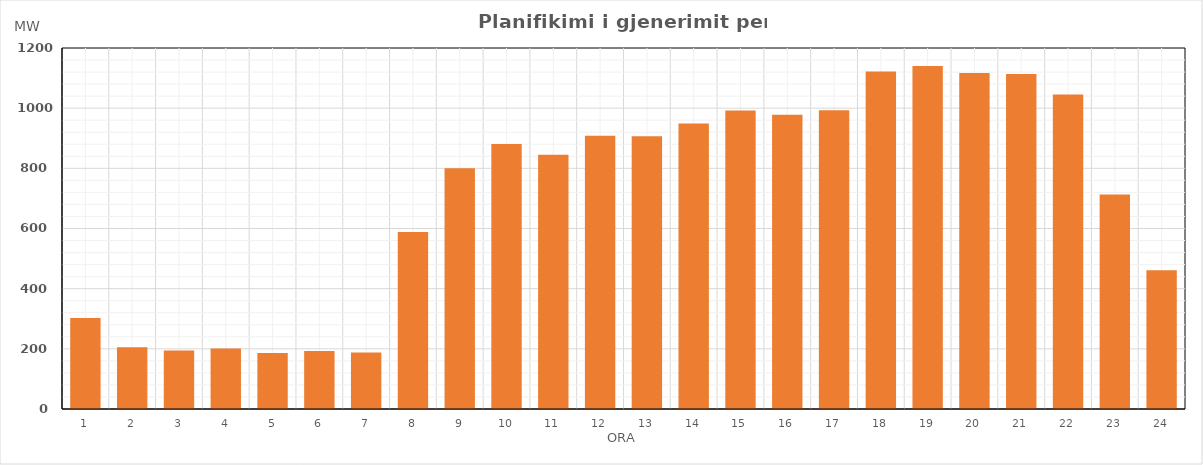
| Category | Max (MW) |
|---|---|
| 0 | 302.632 |
| 1 | 205.184 |
| 2 | 194.057 |
| 3 | 201.162 |
| 4 | 186.184 |
| 5 | 193.129 |
| 6 | 188.149 |
| 7 | 587.969 |
| 8 | 800.338 |
| 9 | 881.036 |
| 10 | 845.474 |
| 11 | 908.005 |
| 12 | 906.498 |
| 13 | 949.325 |
| 14 | 992.134 |
| 15 | 978.223 |
| 16 | 993.021 |
| 17 | 1121.483 |
| 18 | 1139.863 |
| 19 | 1116.557 |
| 20 | 1113.73 |
| 21 | 1045.354 |
| 22 | 712.929 |
| 23 | 461.484 |